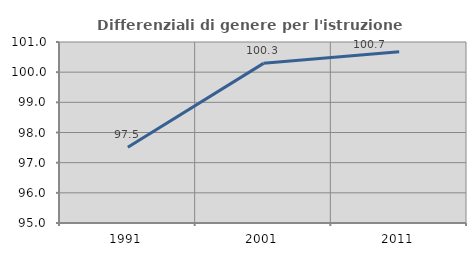
| Category | Differenziali di genere per l'istruzione superiore |
|---|---|
| 1991.0 | 97.51 |
| 2001.0 | 100.292 |
| 2011.0 | 100.676 |